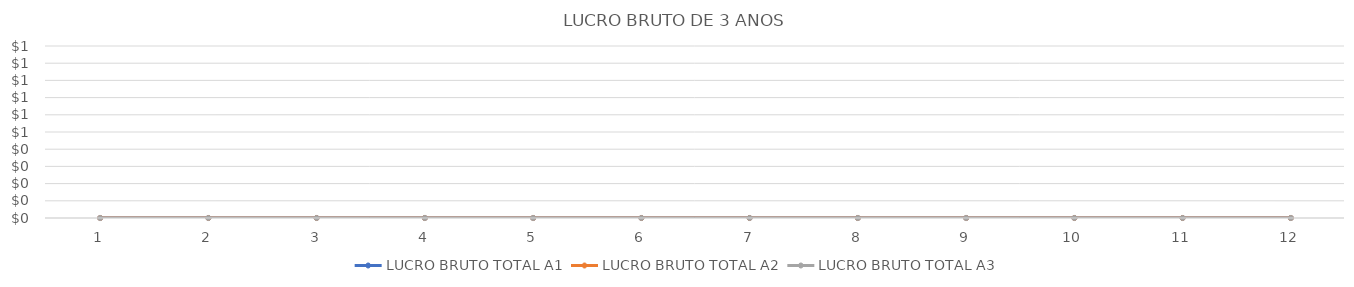
| Category | LUCRO BRUTO TOTAL A1 | LUCRO BRUTO TOTAL A2 | LUCRO BRUTO TOTAL A3 |
|---|---|---|---|
| 0 | 0 | 0 | 0 |
| 1 | 0 | 0 | 0 |
| 2 | 0 | 0 | 0 |
| 3 | 0 | 0 | 0 |
| 4 | 0 | 0 | 0 |
| 5 | 0 | 0 | 0 |
| 6 | 0 | 0 | 0 |
| 7 | 0 | 0 | 0 |
| 8 | 0 | 0 | 0 |
| 9 | 0 | 0 | 0 |
| 10 | 0 | 0 | 0 |
| 11 | 0 | 0 | 0 |